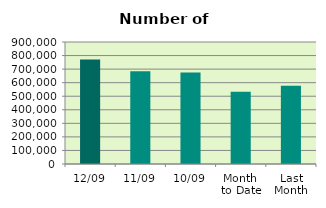
| Category | Series 0 |
|---|---|
| 12/09 | 770006 |
| 11/09 | 684322 |
| 10/09 | 674578 |
| Month 
to Date | 532679.333 |
| Last
Month | 576518.909 |